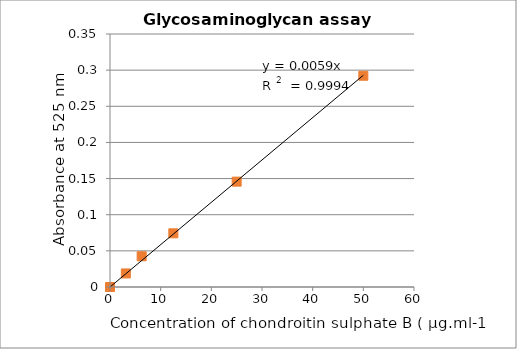
| Category | Series 1 |
|---|---|
| 50.0 | 0.292 |
| 25.0 | 0.146 |
| 12.5 | 0.074 |
| 6.25 | 0.042 |
| 3.125 | 0.019 |
| 0.0 | 0 |